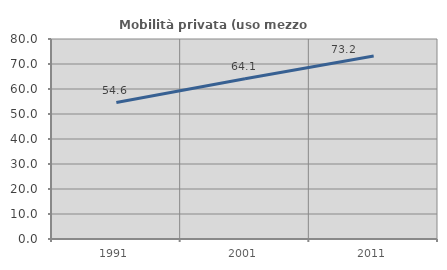
| Category | Mobilità privata (uso mezzo privato) |
|---|---|
| 1991.0 | 54.587 |
| 2001.0 | 64.104 |
| 2011.0 | 73.187 |